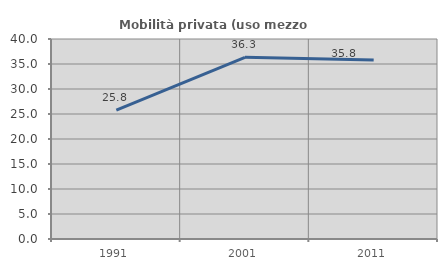
| Category | Mobilità privata (uso mezzo privato) |
|---|---|
| 1991.0 | 25.788 |
| 2001.0 | 36.335 |
| 2011.0 | 35.784 |